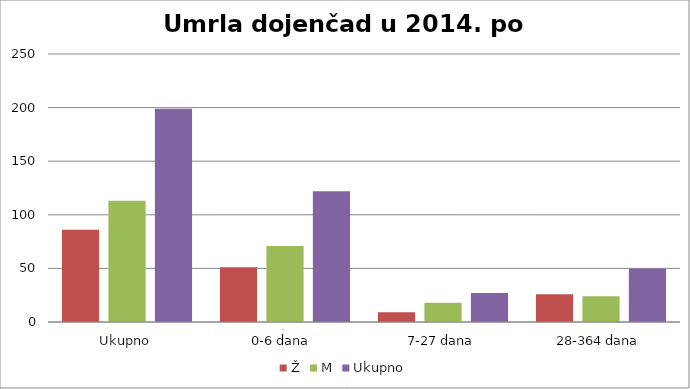
| Category | Ž | M | Ukupno |
|---|---|---|---|
| Ukupno | 86 | 113 | 199 |
| 0-6 dana  | 51 | 71 | 122 |
| 7-27 dana | 9 | 18 | 27 |
| 28-364 dana | 26 | 24 | 50 |